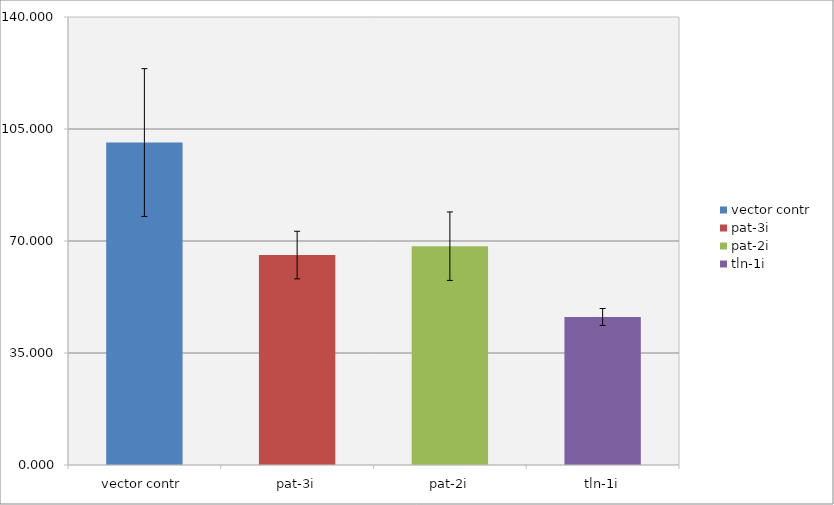
| Category | Series 0 |
|---|---|
| vector contr | 100.763 |
| pat-3i | 65.605 |
| pat-2i | 68.381 |
| tln-1i | 46.262 |